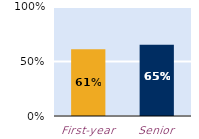
| Category | frequently |
|---|---|
| First-year | 0.613 |
| Senior | 0.654 |